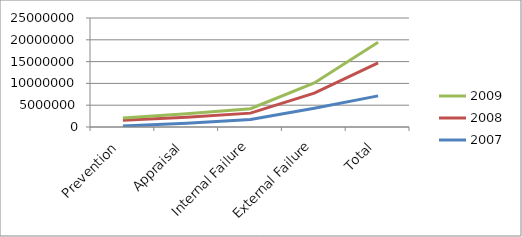
| Category | 2007 | 2008 | 2009 |
|---|---|---|---|
| Prevention | 240000 | 1280000 | 560000 |
| Appraisal | 840000 | 1400000 | 800000 |
| Internal Failure | 1740000 | 1440000 | 1020000 |
| External Failure | 4320000 | 3448000 | 2336000 |
| Total | 7140000 | 7568000 | 4716000 |